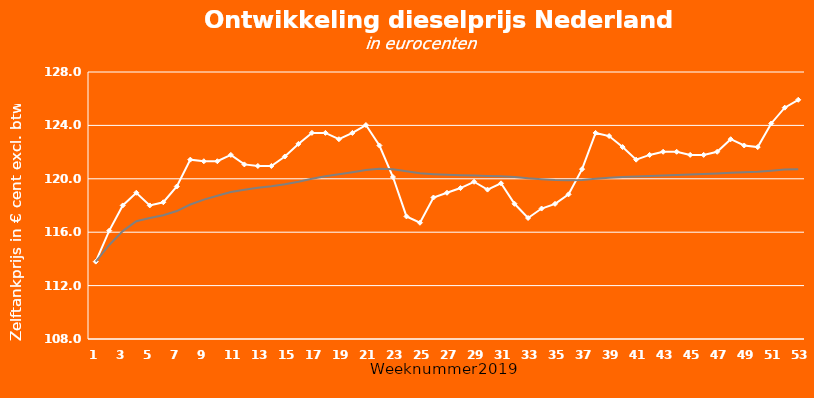
| Category | 1 |
|---|---|
| 1.0 | 113.797 |
| 2.0 | 115.046 |
| 3.0 | 116.082 |
| 4.0 | 116.827 |
| 5.0 | 117.069 |
| 6.0 | 117.27 |
| 7.0 | 117.584 |
| 8.0 | 118.074 |
| 9.0 | 118.44 |
| 10.0 | 118.732 |
| 11.0 | 119.013 |
| 12.0 | 119.188 |
| 13.0 | 119.325 |
| 14.0 | 119.443 |
| 15.0 | 119.593 |
| 16.0 | 119.784 |
| 17.0 | 120.001 |
| 18.0 | 120.193 |
| 19.0 | 120.34 |
| 20.0 | 120.496 |
| 21.0 | 120.666 |
| 22.0 | 120.749 |
| 23.0 | 120.722 |
| 24.0 | 120.574 |
| 25.0 | 120.418 |
| 26.0 | 120.348 |
| 27.0 | 120.296 |
| 28.0 | 120.261 |
| 29.0 | 120.244 |
| 30.0 | 120.209 |
| 31.0 | 120.191 |
| 32.0 | 120.126 |
| 33.0 | 120.033 |
| 34.0 | 119.966 |
| 35.0 | 119.913 |
| 36.0 | 119.883 |
| 37.0 | 119.906 |
| 38.0 | 119.999 |
| 39.0 | 120.082 |
| 40.0 | 120.139 |
| 41.0 | 120.171 |
| 42.0 | 120.21 |
| 43.0 | 120.252 |
| 44.0 | 120.292 |
| 45.0 | 120.326 |
| 46.0 | 120.358 |
| 47.0 | 120.393 |
| 48.0 | 120.447 |
| 49.0 | 120.489 |
| 50.0 | 120.527 |
| 51.0 | 120.598 |
| 52.0 | 120.689 |
| 53.0 | 120.718 |